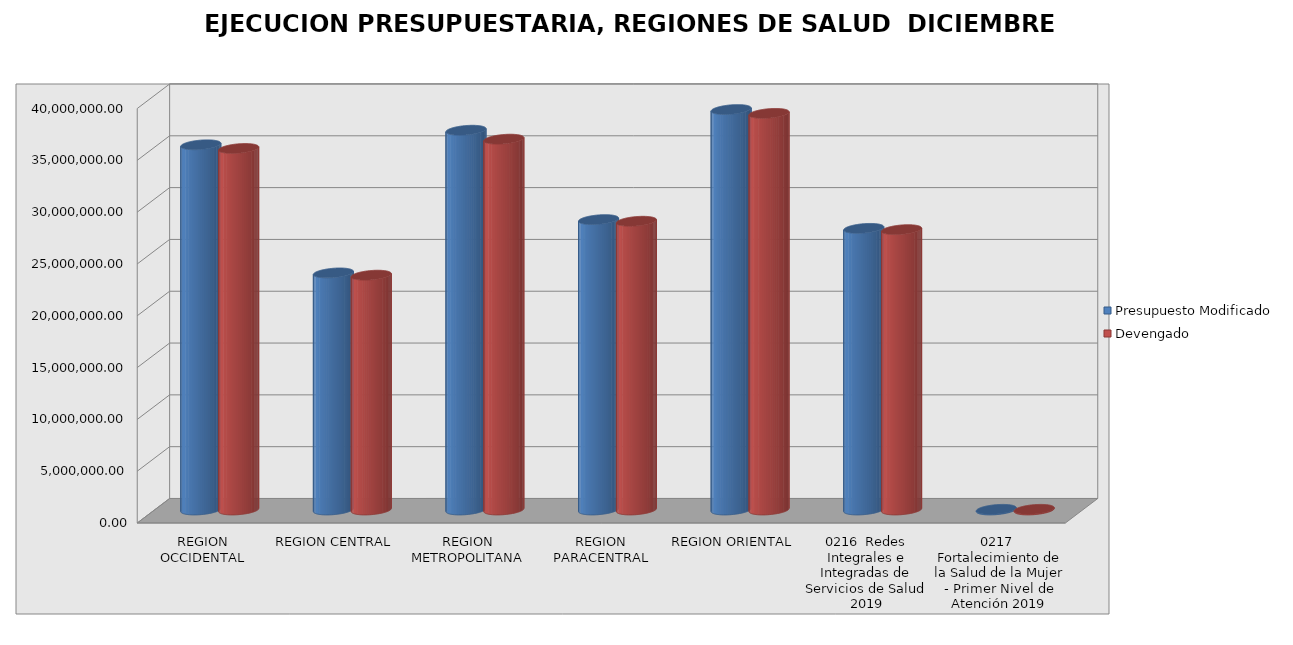
| Category | Presupuesto Modificado | Devengado |
|---|---|---|
| REGION OCCIDENTAL | 35244031 | 34887923.22 |
| REGION CENTRAL | 22877799 | 22661018.32 |
| REGION METROPOLITANA | 36649164 | 35786509.31 |
| REGION PARACENTRAL | 28023771 | 27865851.57 |
| REGION ORIENTAL | 38646176 | 38274645.6 |
| 0216  Redes Integrales e Integradas de Servicios de Salud 2019 | 27178266 | 27053659.76 |
| 0217  Fortalecimiento de la Salud de la Mujer - Primer Nivel de Atención 2019 | 64495 | 64410.36 |